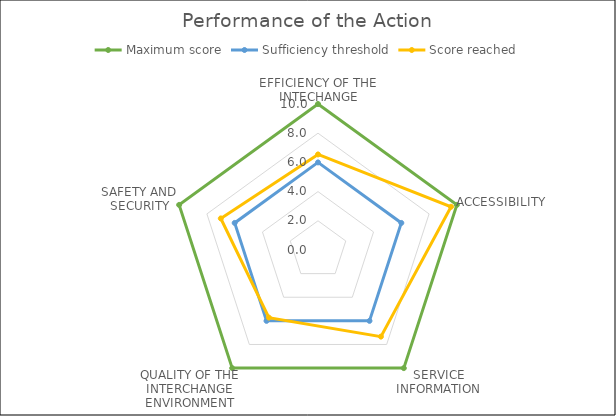
| Category | Maximum score | Sufficiency threshold | Score reached |
|---|---|---|---|
| 0 | 10 | 6 | 6.545 |
| 1 | 10 | 6 | 9.583 |
| 2 | 10 | 6 | 7.333 |
| 3 | 10 | 6 | 5.724 |
| 4 | 10 | 6 | 7 |